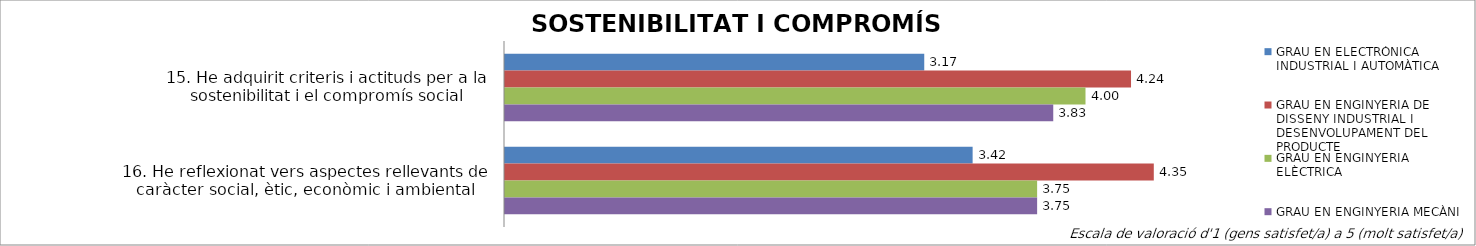
| Category | GRAU EN ELECTRÒNICA INDUSTRIAL I AUTOMÀTICA | GRAU EN ENGINYERIA DE DISSENY INDUSTRIAL I DESENVOLUPAMENT DEL PRODUCTE | GRAU EN ENGINYERIA ELÈCTRICA | GRAU EN ENGINYERIA MECÀNICA |
|---|---|---|---|---|
| 15. He adquirit criteris i actituds per a la sostenibilitat i el compromís social | 3.167 | 4.235 | 4 | 3.833 |
| 16. He reflexionat vers aspectes rellevants de caràcter social, ètic, econòmic i ambiental | 3.417 | 4.353 | 3.75 | 3.75 |